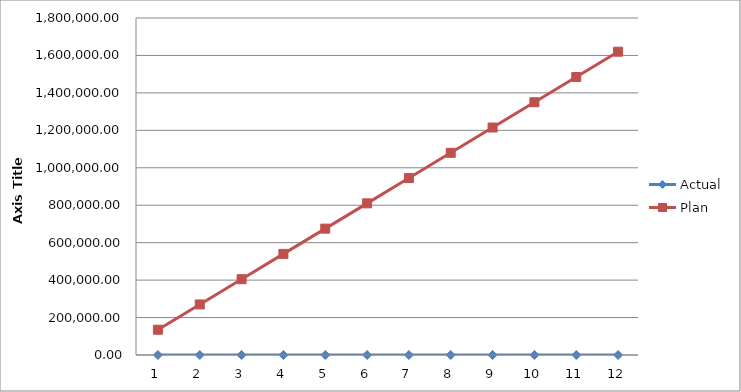
| Category | Actual | Plan |
|---|---|---|
| 0 | 0 | 135000 |
| 1 | 0 | 270000 |
| 2 | 0 | 405000 |
| 3 | 0 | 540000 |
| 4 | 0 | 675000 |
| 5 | 0 | 810000 |
| 6 | 0 | 945000 |
| 7 | 0 | 1080000 |
| 8 | 0 | 1215000 |
| 9 | 0 | 1350000 |
| 10 | 0 | 1485000 |
| 11 | 0 | 1620000 |